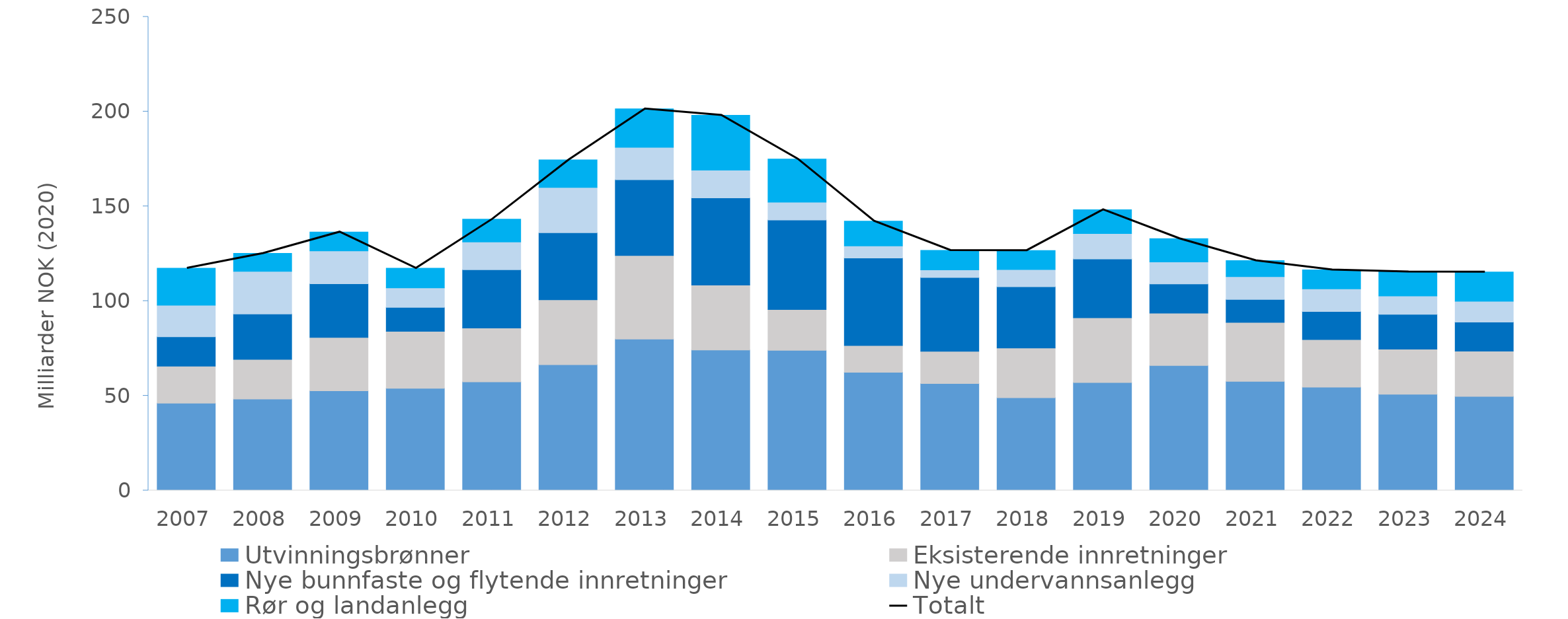
| Category | Utvinningsbrønner | Eksisterende innretninger | Nye bunnfaste og flytende innretninger | Nye undervannsanlegg | Rør og landanlegg |
|---|---|---|---|---|---|
| 2007.0 | 46.13 | 19.471 | 15.525 | 16.638 | 19.559 |
| 2008.0 | 48.31 | 20.898 | 23.966 | 22.487 | 9.494 |
| 2009.0 | 52.64 | 28.188 | 28.308 | 17.311 | 9.984 |
| 2010.0 | 53.95 | 30.049 | 12.714 | 10.267 | 10.316 |
| 2011.0 | 57.376 | 28.423 | 30.708 | 14.655 | 12.093 |
| 2012.0 | 66.428 | 34.277 | 35.393 | 23.87 | 14.515 |
| 2013.0 | 79.923 | 44.155 | 39.948 | 17.071 | 20.32 |
| 2014.0 | 74.174 | 34.287 | 45.978 | 14.664 | 28.98 |
| 2015.0 | 73.993 | 21.559 | 47.223 | 9.402 | 22.8 |
| 2016.0 | 62.405 | 14.166 | 46.144 | 6.344 | 13.115 |
| 2017.0 | 56.459 | 16.981 | 39.017 | 4.014 | 10.286 |
| 2018.0 | 48.972 | 26.246 | 32.336 | 9.072 | 10.06 |
| 2019.0 | 56.991 | 34.173 | 31.078 | 13.403 | 12.581 |
| 2020.0 | 66.002 | 27.608 | 15.481 | 11.556 | 12.292 |
| 2021.0 | 57.615 | 31.087 | 12.162 | 12.048 | 8.438 |
| 2022.0 | 54.597 | 25.057 | 14.828 | 11.908 | 10.036 |
| 2023.0 | 50.784 | 23.839 | 18.387 | 9.691 | 12.69 |
| 2024.0 | 49.646 | 23.965 | 15.308 | 10.963 | 15.446 |